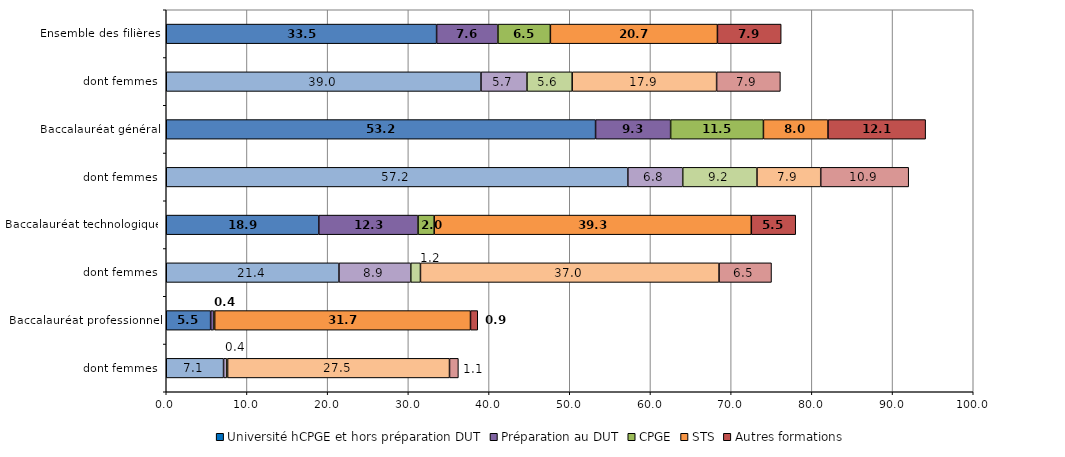
| Category | Université hCPGE et hors préparation DUT | Préparation au DUT | CPGE | STS | Autres formations |
|---|---|---|---|---|---|
| dont femmes | 7.1 | 0.4 | 0.1 | 27.5 | 1.1 |
| Baccalauréat professionnel | 5.5 | 0.4 | 0.1 | 31.7 | 0.9 |
| dont femmes | 21.4 | 8.9 | 1.2 | 37 | 6.5 |
| Baccalauréat technologique | 18.9 | 12.3 | 2 | 39.3 | 5.5 |
| dont femmes | 57.2 | 6.8 | 9.2 | 7.9 | 10.9 |
| Baccalauréat général | 53.2 | 9.3 | 11.5 | 8 | 12.1 |
| dont femmes | 39 | 5.7 | 5.6 | 17.9 | 7.9 |
| Ensemble des filières | 33.5 | 7.6 | 6.5 | 20.7 | 7.9 |